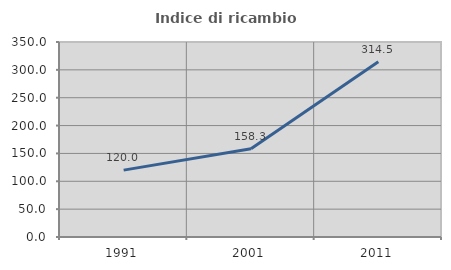
| Category | Indice di ricambio occupazionale  |
|---|---|
| 1991.0 | 120 |
| 2001.0 | 158.257 |
| 2011.0 | 314.483 |